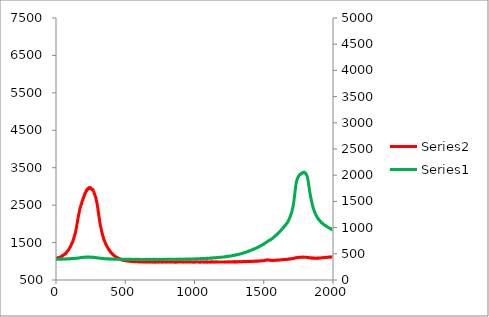
| Category | Series 3 |
|---|---|
| 0.0 | 1085.133 |
| 1.6 | 1083.082 |
| 3.2 | 1078.127 |
| 4.800000000000001 | 1082.572 |
| 6.4 | 1088.005 |
| 8.0 | 1087.011 |
| 9.600000000000001 | 1090.685 |
| 11.200000000000001 | 1092.559 |
| 12.8 | 1095.387 |
| 14.4 | 1096.881 |
| 16.0 | 1089.377 |
| 17.6 | 1094.806 |
| 19.200000000000003 | 1097.806 |
| 20.8 | 1101.088 |
| 22.400000000000002 | 1104.233 |
| 24.0 | 1103.218 |
| 25.6 | 1106.486 |
| 27.200000000000003 | 1108.66 |
| 28.8 | 1106.338 |
| 30.400000000000002 | 1113.265 |
| 32.0 | 1114.327 |
| 33.6 | 1117.335 |
| 35.2 | 1123.057 |
| 36.800000000000004 | 1127.585 |
| 38.400000000000006 | 1121.494 |
| 40.0 | 1134.579 |
| 41.6 | 1132.29 |
| 43.2 | 1141.395 |
| 44.800000000000004 | 1133.466 |
| 46.400000000000006 | 1144.67 |
| 48.0 | 1157.404 |
| 49.6 | 1154.588 |
| 51.2 | 1156.241 |
| 52.800000000000004 | 1164.719 |
| 54.400000000000006 | 1168.017 |
| 56.0 | 1167.921 |
| 57.6 | 1175.929 |
| 59.2 | 1175.406 |
| 60.800000000000004 | 1184.907 |
| 62.400000000000006 | 1191.276 |
| 64.0 | 1200.906 |
| 65.60000000000001 | 1206.279 |
| 67.2 | 1205.083 |
| 68.8 | 1209.04 |
| 70.4 | 1203.188 |
| 72.0 | 1223.452 |
| 73.60000000000001 | 1228.196 |
| 75.2 | 1232.852 |
| 76.80000000000001 | 1245.648 |
| 78.4 | 1248.77 |
| 80.0 | 1250.239 |
| 81.60000000000001 | 1270.887 |
| 83.2 | 1275.57 |
| 84.80000000000001 | 1284.435 |
| 86.4 | 1287.606 |
| 88.0 | 1295.164 |
| 89.60000000000001 | 1303.312 |
| 91.2 | 1311.036 |
| 92.80000000000001 | 1319.194 |
| 94.4 | 1329.428 |
| 96.0 | 1337.02 |
| 97.60000000000001 | 1350.07 |
| 99.2 | 1356.946 |
| 100.80000000000001 | 1367.651 |
| 102.4 | 1387.676 |
| 104.0 | 1389.255 |
| 105.60000000000001 | 1400.378 |
| 107.2 | 1415.27 |
| 108.80000000000001 | 1432.824 |
| 110.4 | 1440.273 |
| 112.0 | 1460.88 |
| 113.60000000000001 | 1466.707 |
| 115.2 | 1490.745 |
| 116.80000000000001 | 1494.801 |
| 118.4 | 1497.975 |
| 120.0 | 1528.735 |
| 121.60000000000001 | 1535.872 |
| 123.2 | 1565.1 |
| 124.80000000000001 | 1569.625 |
| 126.4 | 1590.822 |
| 128.0 | 1607.932 |
| 129.6 | 1632.881 |
| 131.20000000000002 | 1642.616 |
| 132.8 | 1665.691 |
| 134.4 | 1689.312 |
| 136.0 | 1702.389 |
| 137.6 | 1727.844 |
| 139.20000000000002 | 1741.957 |
| 140.8 | 1775.468 |
| 142.4 | 1793.457 |
| 144.0 | 1839.034 |
| 145.6 | 1863.446 |
| 147.20000000000002 | 1893.546 |
| 148.8 | 1923.272 |
| 150.4 | 1970.816 |
| 152.0 | 2001.312 |
| 153.60000000000002 | 2024.387 |
| 155.20000000000002 | 2063.991 |
| 156.8 | 2110.773 |
| 158.4 | 2132.219 |
| 160.0 | 2175.694 |
| 161.60000000000002 | 2202.077 |
| 163.20000000000002 | 2243.546 |
| 164.8 | 2255.842 |
| 166.4 | 2286.741 |
| 168.0 | 2331.374 |
| 169.60000000000002 | 2343.159 |
| 171.20000000000002 | 2378.844 |
| 172.8 | 2407.966 |
| 174.4 | 2433.213 |
| 176.0 | 2447.934 |
| 177.60000000000002 | 2463.975 |
| 179.20000000000002 | 2495.023 |
| 180.8 | 2502.69 |
| 182.4 | 2517.796 |
| 184.0 | 2527.441 |
| 185.60000000000002 | 2548.13 |
| 187.20000000000002 | 2593.335 |
| 188.8 | 2602.443 |
| 190.4 | 2620.04 |
| 192.0 | 2624.901 |
| 193.60000000000002 | 2638.633 |
| 195.20000000000002 | 2690.685 |
| 196.8 | 2677.62 |
| 198.4 | 2687.316 |
| 200.0 | 2706.901 |
| 201.60000000000002 | 2727.224 |
| 203.20000000000002 | 2733.119 |
| 204.8 | 2772.988 |
| 206.4 | 2765.633 |
| 208.0 | 2786.258 |
| 209.60000000000002 | 2821.827 |
| 211.20000000000002 | 2832.872 |
| 212.8 | 2826.179 |
| 214.4 | 2846.525 |
| 216.0 | 2851.608 |
| 217.60000000000002 | 2891.049 |
| 219.20000000000002 | 2890.752 |
| 220.8 | 2881.619 |
| 222.4 | 2888.105 |
| 224.0 | 2910.282 |
| 225.60000000000002 | 2902.042 |
| 227.20000000000002 | 2912.89 |
| 228.8 | 2938.319 |
| 230.4 | 2929.862 |
| 232.0 | 2941.628 |
| 233.60000000000002 | 2944.128 |
| 235.20000000000002 | 2960.196 |
| 236.8 | 2954.423 |
| 238.4 | 2947.799 |
| 240.0 | 2972.396 |
| 241.60000000000002 | 2950.452 |
| 243.20000000000002 | 2971.874 |
| 244.8 | 2942.039 |
| 246.4 | 2948.222 |
| 248.0 | 2968.9 |
| 249.60000000000002 | 2952.022 |
| 251.20000000000002 | 2957.563 |
| 252.8 | 2943.218 |
| 254.4 | 2942.668 |
| 256.0 | 2927.84 |
| 257.6 | 2930.239 |
| 259.2 | 2916.917 |
| 260.8 | 2913.605 |
| 262.40000000000003 | 2945.335 |
| 264.0 | 2898.252 |
| 265.6 | 2908.965 |
| 267.2 | 2907.628 |
| 268.8 | 2900.782 |
| 270.40000000000003 | 2843.017 |
| 272.0 | 2854.514 |
| 273.6 | 2847.483 |
| 275.2 | 2827.043 |
| 276.8 | 2805.674 |
| 278.40000000000003 | 2803.625 |
| 280.0 | 2769.083 |
| 281.6 | 2762.91 |
| 283.2 | 2743.506 |
| 284.8 | 2727.685 |
| 286.40000000000003 | 2713.455 |
| 288.0 | 2694.614 |
| 289.6 | 2648.319 |
| 291.2 | 2630.969 |
| 292.8 | 2613.233 |
| 294.40000000000003 | 2577.586 |
| 296.0 | 2550.778 |
| 297.6 | 2517.705 |
| 299.2 | 2470.94 |
| 300.8 | 2442.092 |
| 302.40000000000003 | 2406.764 |
| 304.0 | 2350.94 |
| 305.6 | 2317.116 |
| 307.20000000000005 | 2283.656 |
| 308.8 | 2236.269 |
| 310.40000000000003 | 2189.489 |
| 312.0 | 2164.498 |
| 313.6 | 2124.341 |
| 315.20000000000005 | 2079.031 |
| 316.8 | 2036.554 |
| 318.40000000000003 | 2006.137 |
| 320.0 | 1966.705 |
| 321.6 | 1938.133 |
| 323.20000000000005 | 1917.228 |
| 324.8 | 1895.968 |
| 326.40000000000003 | 1865.517 |
| 328.0 | 1832.656 |
| 329.6 | 1804.904 |
| 331.20000000000005 | 1777.877 |
| 332.8 | 1760.602 |
| 334.40000000000003 | 1724.784 |
| 336.0 | 1711.208 |
| 337.6 | 1679.789 |
| 339.20000000000005 | 1676.241 |
| 340.8 | 1643.072 |
| 342.40000000000003 | 1634.428 |
| 344.0 | 1595.657 |
| 345.6 | 1584.461 |
| 347.20000000000005 | 1571.789 |
| 348.8 | 1548.847 |
| 350.40000000000003 | 1543.205 |
| 352.0 | 1523.278 |
| 353.6 | 1510.475 |
| 355.20000000000005 | 1498.25 |
| 356.8 | 1480.248 |
| 358.40000000000003 | 1464.894 |
| 360.0 | 1463.875 |
| 361.6 | 1452.106 |
| 363.20000000000005 | 1437.665 |
| 364.8 | 1418.884 |
| 366.40000000000003 | 1413.134 |
| 368.0 | 1399.444 |
| 369.6 | 1389.292 |
| 371.20000000000005 | 1380.312 |
| 372.8 | 1365.565 |
| 374.40000000000003 | 1359.171 |
| 376.0 | 1351.752 |
| 377.6 | 1334.853 |
| 379.20000000000005 | 1324.151 |
| 380.8 | 1311.222 |
| 382.40000000000003 | 1316.472 |
| 384.0 | 1292.948 |
| 385.6 | 1296.633 |
| 387.20000000000005 | 1286.171 |
| 388.8 | 1277.671 |
| 390.40000000000003 | 1269.659 |
| 392.0 | 1254.238 |
| 393.6 | 1248.946 |
| 395.20000000000005 | 1237.08 |
| 396.8 | 1245.588 |
| 398.40000000000003 | 1227.461 |
| 400.0 | 1223.593 |
| 401.6 | 1214.866 |
| 403.20000000000005 | 1211.986 |
| 404.8 | 1199.711 |
| 406.40000000000003 | 1193.293 |
| 408.0 | 1193.224 |
| 409.6 | 1183.844 |
| 411.20000000000005 | 1181.536 |
| 412.8 | 1172.883 |
| 414.40000000000003 | 1167.906 |
| 416.0 | 1159.556 |
| 417.6 | 1161.27 |
| 419.20000000000005 | 1153.753 |
| 420.8 | 1145.915 |
| 422.40000000000003 | 1142.56 |
| 424.0 | 1137.688 |
| 425.6 | 1136.912 |
| 427.20000000000005 | 1131.941 |
| 428.8 | 1128.557 |
| 430.40000000000003 | 1122.295 |
| 432.0 | 1117.295 |
| 433.6 | 1117.012 |
| 435.20000000000005 | 1107.759 |
| 436.8 | 1099.773 |
| 438.40000000000003 | 1091.765 |
| 440.0 | 1105.637 |
| 441.6 | 1097.752 |
| 443.20000000000005 | 1092.066 |
| 444.8 | 1088.728 |
| 446.40000000000003 | 1083.414 |
| 448.0 | 1083.892 |
| 449.6 | 1080.244 |
| 451.20000000000005 | 1076.11 |
| 452.8 | 1070.853 |
| 454.40000000000003 | 1076.637 |
| 456.0 | 1061.307 |
| 457.6 | 1076.685 |
| 459.20000000000005 | 1064.218 |
| 460.8 | 1062.244 |
| 462.40000000000003 | 1062.565 |
| 464.0 | 1060.437 |
| 465.6 | 1050 |
| 467.20000000000005 | 1051.759 |
| 468.8 | 1051.787 |
| 470.40000000000003 | 1044.752 |
| 472.0 | 1041.432 |
| 473.6 | 1048.029 |
| 475.20000000000005 | 1035.898 |
| 476.8 | 1046.162 |
| 478.40000000000003 | 1038.471 |
| 480.0 | 1044.812 |
| 481.6 | 1037.674 |
| 483.20000000000005 | 1028.711 |
| 484.8 | 1032.296 |
| 486.40000000000003 | 1029.102 |
| 488.0 | 1026.176 |
| 489.6 | 1023.876 |
| 491.20000000000005 | 1023.738 |
| 492.8 | 1026.674 |
| 494.40000000000003 | 1025.355 |
| 496.0 | 1027.978 |
| 497.6 | 1025.313 |
| 499.20000000000005 | 1020.733 |
| 500.8 | 1015.721 |
| 502.40000000000003 | 1020.392 |
| 504.0 | 1015.178 |
| 505.6 | 1010.657 |
| 507.20000000000005 | 1020.093 |
| 508.8 | 1015.286 |
| 510.40000000000003 | 1010.077 |
| 512.0 | 1013.928 |
| 513.6 | 1014.639 |
| 515.2 | 1009.572 |
| 516.8000000000001 | 1012.844 |
| 518.4 | 1012.042 |
| 520.0 | 1009.955 |
| 521.6 | 1011.961 |
| 523.2 | 1006.116 |
| 524.8000000000001 | 1005.617 |
| 526.4 | 1002.94 |
| 528.0 | 1002.824 |
| 529.6 | 1003.07 |
| 531.2 | 1001.767 |
| 532.8000000000001 | 1001.998 |
| 534.4 | 999.213 |
| 536.0 | 998.71 |
| 537.6 | 999.917 |
| 539.2 | 998.12 |
| 540.8000000000001 | 998.106 |
| 542.4 | 1003.202 |
| 544.0 | 994.915 |
| 545.6 | 998.61 |
| 547.2 | 993.012 |
| 548.8000000000001 | 995.387 |
| 550.4 | 998.765 |
| 552.0 | 1000.792 |
| 553.6 | 997.329 |
| 555.2 | 989.102 |
| 556.8000000000001 | 992.409 |
| 558.4 | 993.622 |
| 560.0 | 992.042 |
| 561.6 | 992.145 |
| 563.2 | 992.821 |
| 564.8000000000001 | 992.522 |
| 566.4 | 987.235 |
| 568.0 | 988.509 |
| 569.6 | 986.27 |
| 571.2 | 994.063 |
| 572.8000000000001 | 987.863 |
| 574.4 | 991.4 |
| 576.0 | 988.759 |
| 577.6 | 992.989 |
| 579.2 | 992.139 |
| 580.8000000000001 | 988.252 |
| 582.4 | 985.804 |
| 584.0 | 988.778 |
| 585.6 | 983.826 |
| 587.2 | 993.464 |
| 588.8000000000001 | 993.026 |
| 590.4 | 989.654 |
| 592.0 | 991.633 |
| 593.6 | 986.128 |
| 595.2 | 992.253 |
| 596.8000000000001 | 983.4 |
| 598.4 | 986.923 |
| 600.0 | 983.881 |
| 601.6 | 984.474 |
| 603.2 | 989.644 |
| 604.8000000000001 | 982.313 |
| 606.4 | 983.009 |
| 608.0 | 983.216 |
| 609.6 | 985.025 |
| 611.2 | 985.81 |
| 612.8000000000001 | 986.832 |
| 614.4000000000001 | 983.514 |
| 616.0 | 982.235 |
| 617.6 | 982.739 |
| 619.2 | 989.69 |
| 620.8000000000001 | 982.464 |
| 622.4000000000001 | 985.557 |
| 624.0 | 984.355 |
| 625.6 | 986.014 |
| 627.2 | 983.485 |
| 628.8000000000001 | 988.032 |
| 630.4000000000001 | 978.162 |
| 632.0 | 980.106 |
| 633.6 | 983.903 |
| 635.2 | 983.059 |
| 636.8000000000001 | 983.651 |
| 638.4000000000001 | 984.85 |
| 640.0 | 981.232 |
| 641.6 | 982.085 |
| 643.2 | 976.904 |
| 644.8000000000001 | 983.241 |
| 646.4000000000001 | 982.529 |
| 648.0 | 986.745 |
| 649.6 | 984.208 |
| 651.2 | 981.449 |
| 652.8000000000001 | 984.483 |
| 654.4000000000001 | 980.773 |
| 656.0 | 977.131 |
| 657.6 | 983.256 |
| 659.2 | 977.667 |
| 660.8000000000001 | 983.858 |
| 662.4000000000001 | 982.977 |
| 664.0 | 980.369 |
| 665.6 | 984.466 |
| 667.2 | 985.557 |
| 668.8000000000001 | 983.363 |
| 670.4000000000001 | 983.955 |
| 672.0 | 984.012 |
| 673.6 | 976.599 |
| 675.2 | 978.673 |
| 676.8000000000001 | 983.397 |
| 678.4000000000001 | 982.428 |
| 680.0 | 977.93 |
| 681.6 | 984.428 |
| 683.2 | 981.009 |
| 684.8000000000001 | 979.73 |
| 686.4000000000001 | 980.551 |
| 688.0 | 978.997 |
| 689.6 | 984.68 |
| 691.2 | 982.137 |
| 692.8000000000001 | 979.025 |
| 694.4000000000001 | 981.977 |
| 696.0 | 980.322 |
| 697.6 | 980.875 |
| 699.2 | 974.665 |
| 700.8000000000001 | 985.102 |
| 702.4000000000001 | 985.106 |
| 704.0 | 980.327 |
| 705.6 | 978.011 |
| 707.2 | 982.211 |
| 708.8000000000001 | 982.32 |
| 710.4000000000001 | 978.424 |
| 712.0 | 976.003 |
| 713.6 | 978.523 |
| 715.2 | 983.515 |
| 716.8000000000001 | 978.491 |
| 718.4000000000001 | 972.6 |
| 720.0 | 978.631 |
| 721.6 | 977.821 |
| 723.2 | 977.302 |
| 724.8000000000001 | 983.403 |
| 726.4000000000001 | 983.806 |
| 728.0 | 981.322 |
| 729.6 | 985.786 |
| 731.2 | 980.534 |
| 732.8000000000001 | 978.029 |
| 734.4000000000001 | 978.626 |
| 736.0 | 980.343 |
| 737.6 | 980.57 |
| 739.2 | 974.836 |
| 740.8000000000001 | 980.38 |
| 742.4000000000001 | 984.934 |
| 744.0 | 980.969 |
| 745.6 | 982.941 |
| 747.2 | 979.255 |
| 748.8000000000001 | 983.574 |
| 750.4000000000001 | 981.633 |
| 752.0 | 979.052 |
| 753.6 | 981.526 |
| 755.2 | 979.85 |
| 756.8000000000001 | 981.532 |
| 758.4000000000001 | 976.705 |
| 760.0 | 981.628 |
| 761.6 | 979.884 |
| 763.2 | 979.168 |
| 764.8000000000001 | 979.171 |
| 766.4000000000001 | 981.201 |
| 768.0 | 975.335 |
| 769.6 | 980.773 |
| 771.2 | 976.457 |
| 772.8000000000001 | 979.025 |
| 774.4000000000001 | 984.532 |
| 776.0 | 980.148 |
| 777.6 | 985.057 |
| 779.2 | 985.974 |
| 780.8000000000001 | 979.293 |
| 782.4000000000001 | 983.176 |
| 784.0 | 983.678 |
| 785.6 | 983.418 |
| 787.2 | 979.057 |
| 788.8000000000001 | 983.111 |
| 790.4000000000001 | 980.207 |
| 792.0 | 979.517 |
| 793.6 | 977.486 |
| 795.2 | 976.83 |
| 796.8000000000001 | 983.036 |
| 798.4000000000001 | 980.997 |
| 800.0 | 978.167 |
| 801.6 | 985.443 |
| 803.2 | 979.042 |
| 804.8000000000001 | 981.11 |
| 806.4000000000001 | 985.539 |
| 808.0 | 977.208 |
| 809.6 | 979.074 |
| 811.2 | 980.531 |
| 812.8000000000001 | 981.232 |
| 814.4000000000001 | 983.031 |
| 816.0 | 980.915 |
| 817.6 | 985.525 |
| 819.2 | 979.306 |
| 820.8000000000001 | 980.293 |
| 822.4000000000001 | 982.6 |
| 824.0 | 982.532 |
| 825.6 | 979.282 |
| 827.2 | 981.816 |
| 828.8000000000001 | 979.4 |
| 830.4000000000001 | 979.498 |
| 832.0 | 983.961 |
| 833.6 | 975.829 |
| 835.2 | 983.988 |
| 836.8000000000001 | 986.429 |
| 838.4000000000001 | 981.807 |
| 840.0 | 987.178 |
| 841.6 | 988.011 |
| 843.2 | 984.423 |
| 844.8000000000001 | 979.798 |
| 846.4000000000001 | 984.19 |
| 848.0 | 979.136 |
| 849.6 | 982.727 |
| 851.2 | 980.352 |
| 852.8000000000001 | 980.91 |
| 854.4000000000001 | 976.895 |
| 856.0 | 977.917 |
| 857.6 | 981.153 |
| 859.2 | 979.531 |
| 860.8000000000001 | 974.822 |
| 862.4000000000001 | 982.491 |
| 864.0 | 978.086 |
| 865.6 | 975.043 |
| 867.2 | 982.367 |
| 868.8000000000001 | 981.352 |
| 870.4000000000001 | 988.207 |
| 872.0 | 977.724 |
| 873.6 | 976.943 |
| 875.2 | 978.495 |
| 876.8000000000001 | 978.762 |
| 878.4000000000001 | 978.59 |
| 880.0 | 978.125 |
| 881.6 | 982.667 |
| 883.2 | 983.173 |
| 884.8000000000001 | 977.938 |
| 886.4000000000001 | 981.75 |
| 888.0 | 984.889 |
| 889.6 | 984.489 |
| 891.2 | 985.25 |
| 892.8000000000001 | 986.028 |
| 894.4000000000001 | 977.807 |
| 896.0 | 984.478 |
| 897.6 | 981.449 |
| 899.2 | 982.301 |
| 900.8000000000001 | 983.168 |
| 902.4000000000001 | 977.964 |
| 904.0 | 981.414 |
| 905.6 | 981.682 |
| 907.2 | 980.326 |
| 908.8000000000001 | 978.236 |
| 910.4000000000001 | 982.267 |
| 912.0 | 984.159 |
| 913.6 | 984.534 |
| 915.2 | 980.153 |
| 916.8000000000001 | 983.915 |
| 918.4000000000001 | 981.233 |
| 920.0 | 981.542 |
| 921.6 | 978.1 |
| 923.2 | 977.733 |
| 924.8000000000001 | 985.242 |
| 926.4000000000001 | 979.668 |
| 928.0 | 978.461 |
| 929.6 | 979.733 |
| 931.2 | 979.793 |
| 932.8000000000001 | 980.824 |
| 934.4000000000001 | 979.512 |
| 936.0 | 982.583 |
| 937.6 | 980.838 |
| 939.2 | 980.634 |
| 940.8000000000001 | 984.457 |
| 942.4000000000001 | 981.289 |
| 944.0 | 976.625 |
| 945.6 | 980.424 |
| 947.2 | 980.407 |
| 948.8000000000001 | 986.322 |
| 950.4000000000001 | 978.423 |
| 952.0 | 979.414 |
| 953.6 | 985.517 |
| 955.2 | 978.934 |
| 956.8000000000001 | 978.611 |
| 958.4000000000001 | 980.548 |
| 960.0 | 977.71 |
| 961.6 | 979.093 |
| 963.2 | 985.489 |
| 964.8000000000001 | 985.806 |
| 966.4000000000001 | 975.698 |
| 968.0 | 984.989 |
| 969.6 | 985.355 |
| 971.2 | 977.918 |
| 972.8000000000001 | 980.468 |
| 974.4000000000001 | 980.566 |
| 976.0 | 978.517 |
| 977.6 | 979.162 |
| 979.2 | 983.015 |
| 980.8000000000001 | 984.211 |
| 982.4000000000001 | 977.594 |
| 984.0 | 978.782 |
| 985.6 | 980.77 |
| 987.2 | 982.847 |
| 988.8000000000001 | 978.144 |
| 990.4000000000001 | 983.278 |
| 992.0 | 982.752 |
| 993.6 | 974.244 |
| 995.2 | 980.286 |
| 996.8000000000001 | 982.836 |
| 998.4000000000001 | 979.272 |
| 1000.0 | 976.076 |
| 1001.6 | 981.384 |
| 1003.2 | 978.321 |
| 1004.8000000000001 | 983.795 |
| 1006.4000000000001 | 984.809 |
| 1008.0 | 978.748 |
| 1009.6 | 978.536 |
| 1011.2 | 984.409 |
| 1012.8000000000001 | 983.96 |
| 1014.4000000000001 | 980.488 |
| 1016.0 | 983.343 |
| 1017.6 | 978.1 |
| 1019.2 | 981.659 |
| 1020.8000000000001 | 980.247 |
| 1022.4000000000001 | 982.12 |
| 1024.0 | 977.822 |
| 1025.6000000000001 | 983.702 |
| 1027.2 | 981.307 |
| 1028.8 | 978.424 |
| 1030.4 | 978.786 |
| 1032.0 | 979.08 |
| 1033.6000000000001 | 977.276 |
| 1035.2 | 978.588 |
| 1036.8 | 974.768 |
| 1038.4 | 977.998 |
| 1040.0 | 979.466 |
| 1041.6000000000001 | 979.952 |
| 1043.2 | 974.77 |
| 1044.8 | 984.42 |
| 1046.4 | 977.943 |
| 1048.0 | 980.238 |
| 1049.6000000000001 | 980.466 |
| 1051.2 | 980.19 |
| 1052.8 | 986.502 |
| 1054.4 | 982.116 |
| 1056.0 | 981.9 |
| 1057.6000000000001 | 982.182 |
| 1059.2 | 982.971 |
| 1060.8 | 980.401 |
| 1062.4 | 980.108 |
| 1064.0 | 981.539 |
| 1065.6000000000001 | 979.852 |
| 1067.2 | 976.84 |
| 1068.8 | 984.992 |
| 1070.4 | 981.798 |
| 1072.0 | 977.295 |
| 1073.6000000000001 | 976.86 |
| 1075.2 | 979.91 |
| 1076.8 | 982.645 |
| 1078.4 | 979.16 |
| 1080.0 | 981.667 |
| 1081.6000000000001 | 977.376 |
| 1083.2 | 985.44 |
| 1084.8 | 977.626 |
| 1086.4 | 979.344 |
| 1088.0 | 988.539 |
| 1089.6000000000001 | 980.444 |
| 1091.2 | 978.154 |
| 1092.8 | 976.199 |
| 1094.4 | 976.988 |
| 1096.0 | 977.16 |
| 1097.6000000000001 | 978.005 |
| 1099.2 | 979.326 |
| 1100.8 | 981.586 |
| 1102.4 | 980.346 |
| 1104.0 | 978.963 |
| 1105.6000000000001 | 977.588 |
| 1107.2 | 981.025 |
| 1108.8 | 980.801 |
| 1110.4 | 974.928 |
| 1112.0 | 975.768 |
| 1113.6000000000001 | 983.401 |
| 1115.2 | 986.367 |
| 1116.8 | 981.847 |
| 1118.4 | 978.201 |
| 1120.0 | 990.102 |
| 1121.6000000000001 | 980.432 |
| 1123.2 | 979.563 |
| 1124.8 | 985.764 |
| 1126.4 | 984.883 |
| 1128.0 | 976.31 |
| 1129.6000000000001 | 981.813 |
| 1131.2 | 986.039 |
| 1132.8 | 983.735 |
| 1134.4 | 978.062 |
| 1136.0 | 977.253 |
| 1137.6000000000001 | 981.765 |
| 1139.2 | 983.225 |
| 1140.8 | 978.563 |
| 1142.4 | 983.985 |
| 1144.0 | 982.509 |
| 1145.6000000000001 | 985.111 |
| 1147.2 | 976.65 |
| 1148.8 | 980.239 |
| 1150.4 | 977.634 |
| 1152.0 | 981.306 |
| 1153.6000000000001 | 977.974 |
| 1155.2 | 977.789 |
| 1156.8 | 981.46 |
| 1158.4 | 987.367 |
| 1160.0 | 976.346 |
| 1161.6000000000001 | 985.653 |
| 1163.2 | 978.721 |
| 1164.8 | 981.363 |
| 1166.4 | 983.582 |
| 1168.0 | 980.812 |
| 1169.6000000000001 | 982.196 |
| 1171.2 | 979.613 |
| 1172.8 | 980.389 |
| 1174.4 | 979.406 |
| 1176.0 | 980.4 |
| 1177.6000000000001 | 981.667 |
| 1179.2 | 984.074 |
| 1180.8 | 977.855 |
| 1182.4 | 979.624 |
| 1184.0 | 980.718 |
| 1185.6000000000001 | 981.554 |
| 1187.2 | 978.856 |
| 1188.8 | 979.637 |
| 1190.4 | 981.333 |
| 1192.0 | 980.522 |
| 1193.6000000000001 | 983.897 |
| 1195.2 | 982.54 |
| 1196.8 | 979.421 |
| 1198.4 | 982.694 |
| 1200.0 | 980.29 |
| 1201.6000000000001 | 980.779 |
| 1203.2 | 980.732 |
| 1204.8 | 980.71 |
| 1206.4 | 979.855 |
| 1208.0 | 983.9 |
| 1209.6000000000001 | 978.724 |
| 1211.2 | 981.894 |
| 1212.8 | 980.653 |
| 1214.4 | 977.704 |
| 1216.0 | 978.292 |
| 1217.6000000000001 | 984.813 |
| 1219.2 | 984.15 |
| 1220.8 | 975.758 |
| 1222.4 | 979.892 |
| 1224.0 | 985.486 |
| 1225.6000000000001 | 982.02 |
| 1227.2 | 981.432 |
| 1228.8000000000002 | 983.171 |
| 1230.4 | 982.079 |
| 1232.0 | 981.222 |
| 1233.6000000000001 | 981.644 |
| 1235.2 | 982.395 |
| 1236.8000000000002 | 979.735 |
| 1238.4 | 979.659 |
| 1240.0 | 985.93 |
| 1241.6000000000001 | 983.787 |
| 1243.2 | 979.063 |
| 1244.8000000000002 | 983.429 |
| 1246.4 | 982.097 |
| 1248.0 | 988.039 |
| 1249.6000000000001 | 985.603 |
| 1251.2 | 979.488 |
| 1252.8000000000002 | 983.958 |
| 1254.4 | 979.776 |
| 1256.0 | 981.73 |
| 1257.6000000000001 | 983.105 |
| 1259.2 | 980.713 |
| 1260.8000000000002 | 986.909 |
| 1262.4 | 983.775 |
| 1264.0 | 984.688 |
| 1265.6000000000001 | 983.346 |
| 1267.2 | 981.858 |
| 1268.8000000000002 | 985.219 |
| 1270.4 | 981.36 |
| 1272.0 | 983.775 |
| 1273.6000000000001 | 986.869 |
| 1275.2 | 984.772 |
| 1276.8000000000002 | 984.494 |
| 1278.4 | 982.784 |
| 1280.0 | 988.798 |
| 1281.6000000000001 | 980.398 |
| 1283.2 | 982.824 |
| 1284.8000000000002 | 985.018 |
| 1286.4 | 986 |
| 1288.0 | 983.025 |
| 1289.6000000000001 | 993.725 |
| 1291.2 | 977.426 |
| 1292.8000000000002 | 982.41 |
| 1294.4 | 984.316 |
| 1296.0 | 986.946 |
| 1297.6000000000001 | 982.822 |
| 1299.2 | 988.14 |
| 1300.8000000000002 | 985.119 |
| 1302.4 | 983.421 |
| 1304.0 | 986.775 |
| 1305.6000000000001 | 985.489 |
| 1307.2 | 993.565 |
| 1308.8000000000002 | 980.032 |
| 1310.4 | 984.614 |
| 1312.0 | 983.753 |
| 1313.6000000000001 | 985.62 |
| 1315.2 | 987.349 |
| 1316.8000000000002 | 984.614 |
| 1318.4 | 986.995 |
| 1320.0 | 988.651 |
| 1321.6000000000001 | 983.421 |
| 1323.2 | 985.82 |
| 1324.8000000000002 | 987.818 |
| 1326.4 | 991.173 |
| 1328.0 | 993.864 |
| 1329.6000000000001 | 986.139 |
| 1331.2 | 989.179 |
| 1332.8000000000002 | 989.25 |
| 1334.4 | 986.858 |
| 1336.0 | 986.549 |
| 1337.6000000000001 | 981.455 |
| 1339.2 | 985.002 |
| 1340.8000000000002 | 987.505 |
| 1342.4 | 986.327 |
| 1344.0 | 992.719 |
| 1345.6000000000001 | 988.678 |
| 1347.2 | 986.946 |
| 1348.8000000000002 | 991.64 |
| 1350.4 | 990.9 |
| 1352.0 | 991.022 |
| 1353.6000000000001 | 993.227 |
| 1355.2 | 988.173 |
| 1356.8000000000002 | 991.295 |
| 1358.4 | 992.474 |
| 1360.0 | 993.542 |
| 1361.6000000000001 | 991.702 |
| 1363.2 | 992.963 |
| 1364.8000000000002 | 991.409 |
| 1366.4 | 994.324 |
| 1368.0 | 990.68 |
| 1369.6000000000001 | 991.676 |
| 1371.2 | 989.802 |
| 1372.8000000000002 | 993.522 |
| 1374.4 | 988.688 |
| 1376.0 | 990.944 |
| 1377.6000000000001 | 992.782 |
| 1379.2 | 996.486 |
| 1380.8000000000002 | 993.904 |
| 1382.4 | 995.926 |
| 1384.0 | 998.062 |
| 1385.6000000000001 | 998.961 |
| 1387.2 | 996.874 |
| 1388.8000000000002 | 998.759 |
| 1390.4 | 996.773 |
| 1392.0 | 990.838 |
| 1393.6000000000001 | 993.864 |
| 1395.2 | 998.813 |
| 1396.8000000000002 | 995.606 |
| 1398.4 | 993.126 |
| 1400.0 | 994.659 |
| 1401.6000000000001 | 995.046 |
| 1403.2 | 1000.106 |
| 1404.8000000000002 | 996.904 |
| 1406.4 | 996.679 |
| 1408.0 | 1000.762 |
| 1409.6000000000001 | 997.977 |
| 1411.2 | 1001.656 |
| 1412.8000000000002 | 994.052 |
| 1414.4 | 999.367 |
| 1416.0 | 996.174 |
| 1417.6000000000001 | 997.108 |
| 1419.2 | 997.167 |
| 1420.8000000000002 | 1003.806 |
| 1422.4 | 999.131 |
| 1424.0 | 997.042 |
| 1425.6000000000001 | 996.557 |
| 1427.2 | 1000.928 |
| 1428.8000000000002 | 1001.912 |
| 1430.4 | 1000.642 |
| 1432.0 | 1001.145 |
| 1433.6000000000001 | 1002.147 |
| 1435.2 | 1003.789 |
| 1436.8000000000002 | 1007.006 |
| 1438.4 | 1003.498 |
| 1440.0 | 1005.248 |
| 1441.6000000000001 | 1000.657 |
| 1443.2 | 1004.258 |
| 1444.8000000000002 | 999.313 |
| 1446.4 | 1004.491 |
| 1448.0 | 1006.809 |
| 1449.6000000000001 | 1003.586 |
| 1451.2 | 1001.497 |
| 1452.8000000000002 | 1005.86 |
| 1454.4 | 1001.742 |
| 1456.0 | 1007.077 |
| 1457.6000000000001 | 1001.739 |
| 1459.2 | 1006.457 |
| 1460.8000000000002 | 1006.906 |
| 1462.4 | 1005.94 |
| 1464.0 | 1007.394 |
| 1465.6000000000001 | 1004.799 |
| 1467.2 | 1007.727 |
| 1468.8000000000002 | 1007.775 |
| 1470.4 | 1007.941 |
| 1472.0 | 1005.381 |
| 1473.6000000000001 | 1009.881 |
| 1475.2 | 1010.216 |
| 1476.8000000000002 | 1012.531 |
| 1478.4 | 1009.265 |
| 1480.0 | 1010.875 |
| 1481.6000000000001 | 1013.057 |
| 1483.2 | 1013.006 |
| 1484.8000000000002 | 1012.327 |
| 1486.4 | 1011.079 |
| 1488.0 | 1009.324 |
| 1489.6000000000001 | 1013.892 |
| 1491.2 | 1010.799 |
| 1492.8000000000002 | 1012.119 |
| 1494.4 | 1012.464 |
| 1496.0 | 1012.892 |
| 1497.6000000000001 | 1016.932 |
| 1499.2 | 1015.154 |
| 1500.8000000000002 | 1015.475 |
| 1502.4 | 1015.383 |
| 1504.0 | 1021.537 |
| 1505.6000000000001 | 1022.787 |
| 1507.2 | 1023.778 |
| 1508.8000000000002 | 1030.13 |
| 1510.4 | 1024.159 |
| 1512.0 | 1028.826 |
| 1513.6000000000001 | 1029.415 |
| 1515.2 | 1026.252 |
| 1516.8000000000002 | 1028.02 |
| 1518.4 | 1029.506 |
| 1520.0 | 1033.56 |
| 1521.6000000000001 | 1033.528 |
| 1523.2 | 1038.73 |
| 1524.8000000000002 | 1032.671 |
| 1526.4 | 1038.168 |
| 1528.0 | 1039.003 |
| 1529.6000000000001 | 1037.031 |
| 1531.2 | 1033.06 |
| 1532.8000000000002 | 1035.031 |
| 1534.4 | 1035.157 |
| 1536.0 | 1036.387 |
| 1537.6000000000001 | 1036.333 |
| 1539.2 | 1035.103 |
| 1540.8000000000002 | 1028.941 |
| 1542.4 | 1030.445 |
| 1544.0 | 1029.881 |
| 1545.6000000000001 | 1030.421 |
| 1547.2 | 1028.651 |
| 1548.8000000000002 | 1023.887 |
| 1550.4 | 1022.941 |
| 1552.0 | 1021.449 |
| 1553.6000000000001 | 1022.179 |
| 1555.2 | 1022.671 |
| 1556.8000000000002 | 1018.822 |
| 1558.4 | 1020.821 |
| 1560.0 | 1021.284 |
| 1561.6000000000001 | 1025.167 |
| 1563.2 | 1021.353 |
| 1564.8000000000002 | 1025.011 |
| 1566.4 | 1018.969 |
| 1568.0 | 1019.21 |
| 1569.6000000000001 | 1024.477 |
| 1571.2 | 1019.122 |
| 1572.8000000000002 | 1020.992 |
| 1574.4 | 1025.123 |
| 1576.0 | 1023.952 |
| 1577.6000000000001 | 1027.205 |
| 1579.2 | 1027.35 |
| 1580.8000000000002 | 1026.236 |
| 1582.4 | 1029.86 |
| 1584.0 | 1024.44 |
| 1585.6000000000001 | 1027.14 |
| 1587.2 | 1031.305 |
| 1588.8000000000002 | 1029.897 |
| 1590.4 | 1029.469 |
| 1592.0 | 1027.003 |
| 1593.6000000000001 | 1029.623 |
| 1595.2 | 1033.644 |
| 1596.8000000000002 | 1026.119 |
| 1598.4 | 1031.804 |
| 1600.0 | 1031.125 |
| 1601.6000000000001 | 1032.481 |
| 1603.2 | 1033.864 |
| 1604.8000000000002 | 1032.296 |
| 1606.4 | 1034.029 |
| 1608.0 | 1033.278 |
| 1609.6000000000001 | 1028.949 |
| 1611.2 | 1033.245 |
| 1612.8000000000002 | 1033.509 |
| 1614.4 | 1037.695 |
| 1616.0 | 1037.455 |
| 1617.6000000000001 | 1037.29 |
| 1619.2 | 1032.437 |
| 1620.8000000000002 | 1037.225 |
| 1622.4 | 1037.498 |
| 1624.0 | 1041.497 |
| 1625.6000000000001 | 1038.932 |
| 1627.2 | 1040.272 |
| 1628.8000000000002 | 1039.267 |
| 1630.4 | 1039.977 |
| 1632.0 | 1040.083 |
| 1633.6000000000001 | 1045.293 |
| 1635.2 | 1040.284 |
| 1636.8000000000002 | 1041.614 |
| 1638.4 | 1041.571 |
| 1640.0 | 1043.458 |
| 1641.6000000000001 | 1044.253 |
| 1643.2 | 1044.329 |
| 1644.8000000000002 | 1047.31 |
| 1646.4 | 1045.606 |
| 1648.0 | 1046.025 |
| 1649.6000000000001 | 1049.801 |
| 1651.2 | 1045.33 |
| 1652.8000000000002 | 1051.4 |
| 1654.4 | 1047.224 |
| 1656.0 | 1046.921 |
| 1657.6000000000001 | 1045.074 |
| 1659.2 | 1048.955 |
| 1660.8000000000002 | 1052.233 |
| 1662.4 | 1046.869 |
| 1664.0 | 1055.634 |
| 1665.6000000000001 | 1052.242 |
| 1667.2 | 1051.543 |
| 1668.8000000000002 | 1049.332 |
| 1670.4 | 1054.969 |
| 1672.0 | 1051.988 |
| 1673.6000000000001 | 1054.623 |
| 1675.2 | 1055.815 |
| 1676.8000000000002 | 1058.554 |
| 1678.4 | 1058.586 |
| 1680.0 | 1056.566 |
| 1681.6000000000001 | 1064.228 |
| 1683.2 | 1064.915 |
| 1684.8000000000002 | 1059.301 |
| 1686.4 | 1062.066 |
| 1688.0 | 1064.284 |
| 1689.6000000000001 | 1056.316 |
| 1691.2 | 1065.594 |
| 1692.8000000000002 | 1065.005 |
| 1694.4 | 1067.772 |
| 1696.0 | 1065.182 |
| 1697.6000000000001 | 1065.492 |
| 1699.2 | 1069.377 |
| 1700.8000000000002 | 1070.151 |
| 1702.4 | 1068.591 |
| 1704.0 | 1071.045 |
| 1705.6000000000001 | 1070.784 |
| 1707.2 | 1073.611 |
| 1708.8000000000002 | 1075.909 |
| 1710.4 | 1078.182 |
| 1712.0 | 1076.608 |
| 1713.6000000000001 | 1077.525 |
| 1715.2 | 1077.244 |
| 1716.8000000000002 | 1078.861 |
| 1718.4 | 1079.363 |
| 1720.0 | 1083.951 |
| 1721.6000000000001 | 1082.103 |
| 1723.2 | 1085.585 |
| 1724.8000000000002 | 1085.147 |
| 1726.4 | 1087.576 |
| 1728.0 | 1091.281 |
| 1729.6000000000001 | 1091.836 |
| 1731.2 | 1092.738 |
| 1732.8000000000002 | 1095.664 |
| 1734.4 | 1093.827 |
| 1736.0 | 1097.733 |
| 1737.6000000000001 | 1095.031 |
| 1739.2 | 1097.744 |
| 1740.8000000000002 | 1098.969 |
| 1742.4 | 1104.688 |
| 1744.0 | 1102.029 |
| 1745.6000000000001 | 1103.914 |
| 1747.2 | 1103.128 |
| 1748.8000000000002 | 1102.349 |
| 1750.4 | 1104.384 |
| 1752.0 | 1102.231 |
| 1753.6000000000001 | 1103.233 |
| 1755.2 | 1105.407 |
| 1756.8000000000002 | 1105.986 |
| 1758.4 | 1109.835 |
| 1760.0 | 1107.207 |
| 1761.6000000000001 | 1106.776 |
| 1763.2 | 1108.849 |
| 1764.8000000000002 | 1109.613 |
| 1766.4 | 1103.515 |
| 1768.0 | 1106.536 |
| 1769.6000000000001 | 1110.377 |
| 1771.2 | 1107.824 |
| 1772.8000000000002 | 1109.914 |
| 1774.4 | 1109.622 |
| 1776.0 | 1111.338 |
| 1777.6000000000001 | 1107.863 |
| 1779.2 | 1111.974 |
| 1780.8000000000002 | 1109.486 |
| 1782.4 | 1112.011 |
| 1784.0 | 1109.46 |
| 1785.6000000000001 | 1113.532 |
| 1787.2 | 1113.588 |
| 1788.8000000000002 | 1107.852 |
| 1790.4 | 1110.884 |
| 1792.0 | 1109.072 |
| 1793.6000000000001 | 1109.81 |
| 1795.2 | 1108.657 |
| 1796.8000000000002 | 1106.872 |
| 1798.4 | 1104.867 |
| 1800.0 | 1111.679 |
| 1801.6000000000001 | 1109.441 |
| 1803.2 | 1110.239 |
| 1804.8000000000002 | 1104.847 |
| 1806.4 | 1106.366 |
| 1808.0 | 1105.702 |
| 1809.6000000000001 | 1103.918 |
| 1811.2 | 1103.017 |
| 1812.8000000000002 | 1101.253 |
| 1814.4 | 1104.15 |
| 1816.0 | 1103.645 |
| 1817.6000000000001 | 1102.52 |
| 1819.2 | 1099.787 |
| 1820.8000000000002 | 1099.676 |
| 1822.4 | 1102.486 |
| 1824.0 | 1094.741 |
| 1825.6000000000001 | 1097.309 |
| 1827.2 | 1096.582 |
| 1828.8000000000002 | 1094.881 |
| 1830.4 | 1093.281 |
| 1832.0 | 1094.786 |
| 1833.6000000000001 | 1090.452 |
| 1835.2 | 1090.647 |
| 1836.8000000000002 | 1091.838 |
| 1838.4 | 1087.34 |
| 1840.0 | 1088.986 |
| 1841.6000000000001 | 1091.43 |
| 1843.2 | 1087.519 |
| 1844.8000000000002 | 1088.302 |
| 1846.4 | 1093.711 |
| 1848.0 | 1084.011 |
| 1849.6000000000001 | 1081.488 |
| 1851.2 | 1087.699 |
| 1852.8000000000002 | 1088.204 |
| 1854.4 | 1089.483 |
| 1856.0 | 1084.278 |
| 1857.6000000000001 | 1084.012 |
| 1859.2 | 1081.73 |
| 1860.8000000000002 | 1084.995 |
| 1862.4 | 1084.582 |
| 1864.0 | 1086.034 |
| 1865.6000000000001 | 1084.731 |
| 1867.2 | 1080.662 |
| 1868.8000000000002 | 1084.304 |
| 1870.4 | 1083.978 |
| 1872.0 | 1077.093 |
| 1873.6000000000001 | 1082.193 |
| 1875.2 | 1082.221 |
| 1876.8000000000002 | 1081.463 |
| 1878.4 | 1080.488 |
| 1880.0 | 1082.282 |
| 1881.6000000000001 | 1085.361 |
| 1883.2 | 1084.673 |
| 1884.8000000000002 | 1081.193 |
| 1886.4 | 1085.608 |
| 1888.0 | 1083.072 |
| 1889.6000000000001 | 1081.793 |
| 1891.2 | 1086.769 |
| 1892.8000000000002 | 1087.261 |
| 1894.4 | 1078.576 |
| 1896.0 | 1083.398 |
| 1897.6000000000001 | 1084.718 |
| 1899.2 | 1086.858 |
| 1900.8000000000002 | 1091.321 |
| 1902.4 | 1086.684 |
| 1904.0 | 1087.59 |
| 1905.6000000000001 | 1084.406 |
| 1907.2 | 1087.605 |
| 1908.8000000000002 | 1091.42 |
| 1910.4 | 1085.779 |
| 1912.0 | 1086.778 |
| 1913.6000000000001 | 1088.117 |
| 1915.2 | 1088.477 |
| 1916.8000000000002 | 1091.748 |
| 1918.4 | 1091.097 |
| 1920.0 | 1090.89 |
| 1921.6000000000001 | 1096.471 |
| 1923.2 | 1095.5 |
| 1924.8000000000002 | 1098.676 |
| 1926.4 | 1092.659 |
| 1928.0 | 1096.613 |
| 1929.6000000000001 | 1092.769 |
| 1931.2 | 1096.438 |
| 1932.8000000000002 | 1098.019 |
| 1934.4 | 1095.488 |
| 1936.0 | 1098.083 |
| 1937.6000000000001 | 1098.38 |
| 1939.2 | 1097.333 |
| 1940.8000000000002 | 1100.548 |
| 1942.4 | 1097.071 |
| 1944.0 | 1103.957 |
| 1945.6000000000001 | 1101.523 |
| 1947.2 | 1098.951 |
| 1948.8000000000002 | 1101.096 |
| 1950.4 | 1104.485 |
| 1952.0 | 1104.986 |
| 1953.6000000000001 | 1104.606 |
| 1955.2 | 1105.946 |
| 1956.8000000000002 | 1106.312 |
| 1958.4 | 1103.389 |
| 1960.0 | 1107.853 |
| 1961.6000000000001 | 1104.86 |
| 1963.2 | 1109.932 |
| 1964.8000000000002 | 1109.122 |
| 1966.4 | 1108.011 |
| 1968.0 | 1109.756 |
| 1969.6000000000001 | 1115.225 |
| 1971.2 | 1112.498 |
| 1972.8000000000002 | 1110.642 |
| 1974.4 | 1112.204 |
| 1976.0 | 1115.182 |
| 1977.6000000000001 | 1115.329 |
| 1979.2 | 1114.37 |
| 1980.8000000000002 | 1109.596 |
| 1982.4 | 1118.674 |
| 1984.0 | 1111.316 |
| 1985.6000000000001 | 1112.076 |
| 1987.2 | 1111.577 |
| 1988.8000000000002 | 1114.072 |
| 1990.4 | 1117.017 |
| 1992.0 | 1117.944 |
| 1993.6000000000001 | 1114.042 |
| 1995.2 | 1112.613 |